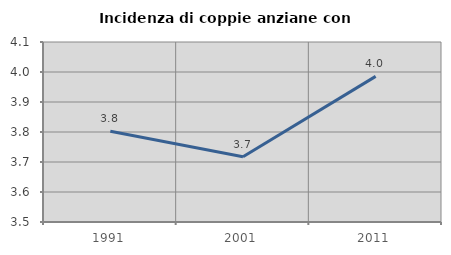
| Category | Incidenza di coppie anziane con figli |
|---|---|
| 1991.0 | 3.802 |
| 2001.0 | 3.717 |
| 2011.0 | 3.986 |